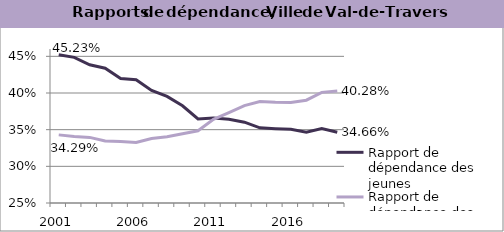
| Category | Rapport de dépendance des jeunes | Rapport de dépendance des personnes âgées |
|---|---|---|
| 2001.0 | 0.452 | 0.343 |
| 2002.0 | 0.449 | 0.341 |
| 2003.0 | 0.439 | 0.339 |
| 2004.0 | 0.434 | 0.335 |
| 2005.0 | 0.42 | 0.334 |
| 2006.0 | 0.418 | 0.332 |
| 2007.0 | 0.403 | 0.338 |
| 2008.0 | 0.395 | 0.34 |
| 2009.0 | 0.383 | 0.345 |
| 2010.0 | 0.365 | 0.348 |
| 2011.0 | 0.366 | 0.364 |
| 2012.0 | 0.364 | 0.373 |
| 2013.0 | 0.36 | 0.383 |
| 2014.0 | 0.352 | 0.388 |
| 2015.0 | 0.351 | 0.387 |
| 2016.0 | 0.35 | 0.387 |
| 2017.0 | 0.347 | 0.39 |
| 2018.0 | 0.352 | 0.401 |
| 2019.0 | 0.347 | 0.403 |